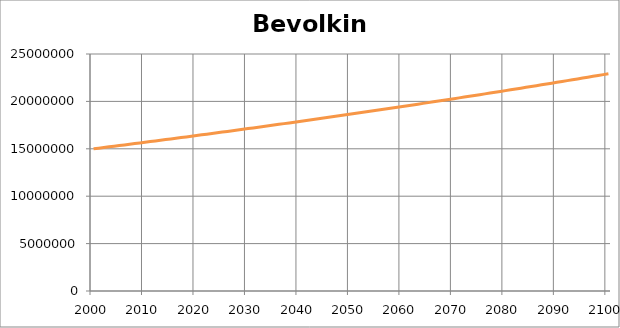
| Category | Bevolking |
|---|---|
| 2000.0 | 15000000 |
| 2001.0 | 15068000 |
| 2002.0 | 15136204 |
| 2003.0 | 15204612.612 |
| 2004.0 | 15273226.45 |
| 2005.0 | 15342046.129 |
| 2006.0 | 15411072.268 |
| 2007.0 | 15480305.484 |
| 2008.0 | 15549746.401 |
| 2009.0 | 15619395.64 |
| 2010.0 | 15689253.827 |
| 2011.0 | 15759321.588 |
| 2012.0 | 15829599.553 |
| 2013.0 | 15900088.352 |
| 2014.0 | 15970788.617 |
| 2015.0 | 16041700.983 |
| 2016.0 | 16112826.086 |
| 2017.0 | 16184164.564 |
| 2018.0 | 16255717.058 |
| 2019.0 | 16327484.209 |
| 2020.0 | 16399466.661 |
| 2021.0 | 16471665.061 |
| 2022.0 | 16544080.057 |
| 2023.0 | 16616712.297 |
| 2024.0 | 16689562.434 |
| 2025.0 | 16762631.121 |
| 2026.0 | 16835919.014 |
| 2027.0 | 16909426.771 |
| 2028.0 | 16983155.052 |
| 2029.0 | 17057104.517 |
| 2030.0 | 17131275.83 |
| 2031.0 | 17205669.658 |
| 2032.0 | 17280286.667 |
| 2033.0 | 17355127.527 |
| 2034.0 | 17430192.909 |
| 2035.0 | 17505483.488 |
| 2036.0 | 17580999.939 |
| 2037.0 | 17656742.938 |
| 2038.0 | 17732713.167 |
| 2039.0 | 17808911.307 |
| 2040.0 | 17885338.041 |
| 2041.0 | 17961994.055 |
| 2042.0 | 18038880.037 |
| 2043.0 | 18115996.677 |
| 2044.0 | 18193344.667 |
| 2045.0 | 18270924.701 |
| 2046.0 | 18348737.475 |
| 2047.0 | 18426783.688 |
| 2048.0 | 18505064.039 |
| 2049.0 | 18583579.231 |
| 2050.0 | 18662329.969 |
| 2051.0 | 18741316.958 |
| 2052.0 | 18820540.909 |
| 2053.0 | 18900002.532 |
| 2054.0 | 18979702.54 |
| 2055.0 | 19059641.647 |
| 2056.0 | 19139820.572 |
| 2057.0 | 19220240.034 |
| 2058.0 | 19300900.754 |
| 2059.0 | 19381803.456 |
| 2060.0 | 19462948.867 |
| 2061.0 | 19544337.713 |
| 2062.0 | 19625970.726 |
| 2063.0 | 19707848.639 |
| 2064.0 | 19789972.184 |
| 2065.0 | 19872342.101 |
| 2066.0 | 19954959.127 |
| 2067.0 | 20037824.005 |
| 2068.0 | 20120937.477 |
| 2069.0 | 20204300.289 |
| 2070.0 | 20287913.19 |
| 2071.0 | 20371776.93 |
| 2072.0 | 20455892.26 |
| 2073.0 | 20540259.937 |
| 2074.0 | 20624880.717 |
| 2075.0 | 20709755.359 |
| 2076.0 | 20794884.625 |
| 2077.0 | 20880269.279 |
| 2078.0 | 20965910.087 |
| 2079.0 | 21051807.817 |
| 2080.0 | 21137963.241 |
| 2081.0 | 21224377.13 |
| 2082.0 | 21311050.262 |
| 2083.0 | 21397983.413 |
| 2084.0 | 21485177.363 |
| 2085.0 | 21572632.895 |
| 2086.0 | 21660350.794 |
| 2087.0 | 21748331.846 |
| 2088.0 | 21836576.841 |
| 2089.0 | 21925086.572 |
| 2090.0 | 22013861.832 |
| 2091.0 | 22102903.417 |
| 2092.0 | 22192212.127 |
| 2093.0 | 22281788.764 |
| 2094.0 | 22371634.13 |
| 2095.0 | 22461749.033 |
| 2096.0 | 22552134.28 |
| 2097.0 | 22642790.682 |
| 2098.0 | 22733719.055 |
| 2099.0 | 22824920.212 |
| 2100.0 | 22916394.972 |